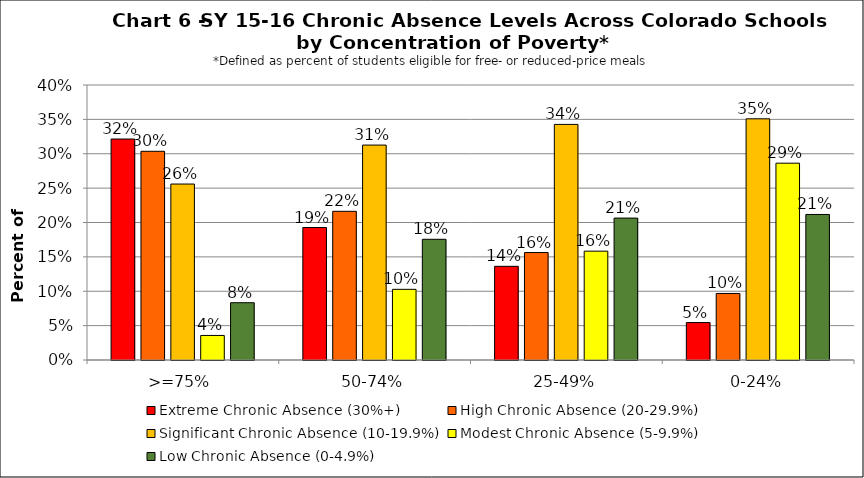
| Category | Extreme Chronic Absence (30%+) | High Chronic Absence (20-29.9%) | Significant Chronic Absence (10-19.9%) | Modest Chronic Absence (5-9.9%) | Low Chronic Absence (0-4.9%) |
|---|---|---|---|---|---|
| 0 | 0.321 | 0.304 | 0.256 | 0.036 | 0.083 |
| 1 | 0.193 | 0.216 | 0.313 | 0.103 | 0.176 |
| 2 | 0.136 | 0.156 | 0.343 | 0.158 | 0.206 |
| 3 | 0.054 | 0.097 | 0.351 | 0.286 | 0.212 |